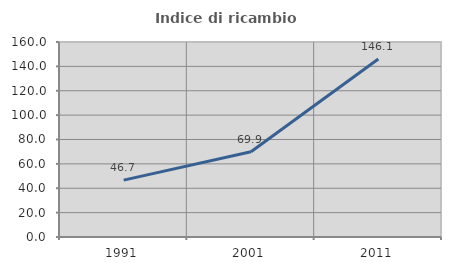
| Category | Indice di ricambio occupazionale  |
|---|---|
| 1991.0 | 46.667 |
| 2001.0 | 69.892 |
| 2011.0 | 146.091 |